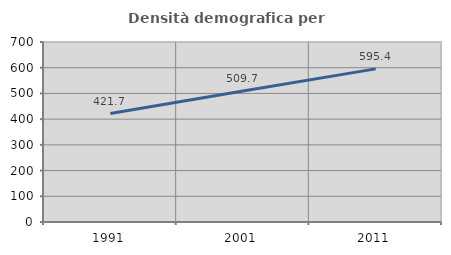
| Category | Densità demografica |
|---|---|
| 1991.0 | 421.72 |
| 2001.0 | 509.669 |
| 2011.0 | 595.433 |